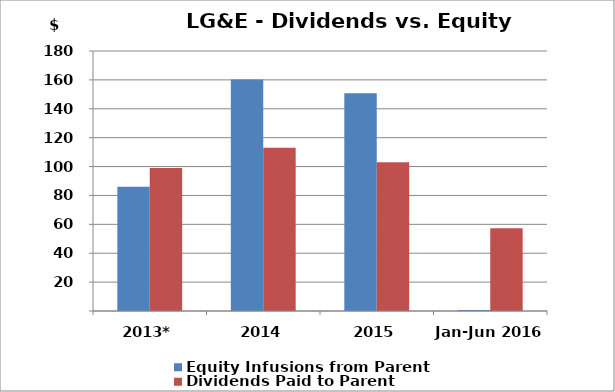
| Category | Equity Infusions from Parent | Dividends Paid to Parent |
|---|---|---|
| 2013* | 86 | 99 |
| 2014 | 160.311 | 113.034 |
| 2015 | 150.799 | 102.914 |
| Jan-Jun 2016 | 0.714 | 57.349 |